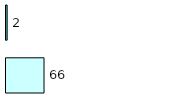
| Category | Series 0 | Series 1 |
|---|---|---|
| 0 | 66 | 2 |